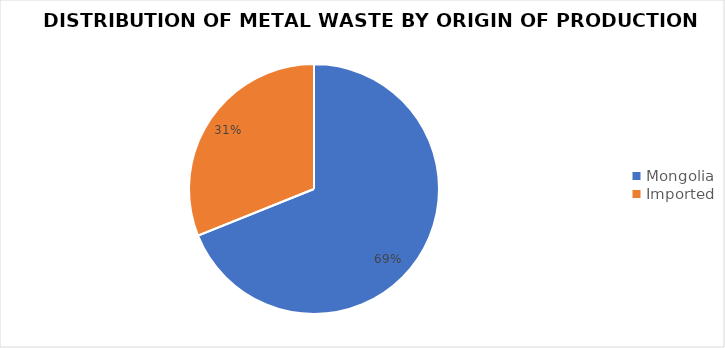
| Category | Series 0 |
|---|---|
| Mongolia | 1295 |
| Imported | 584 |